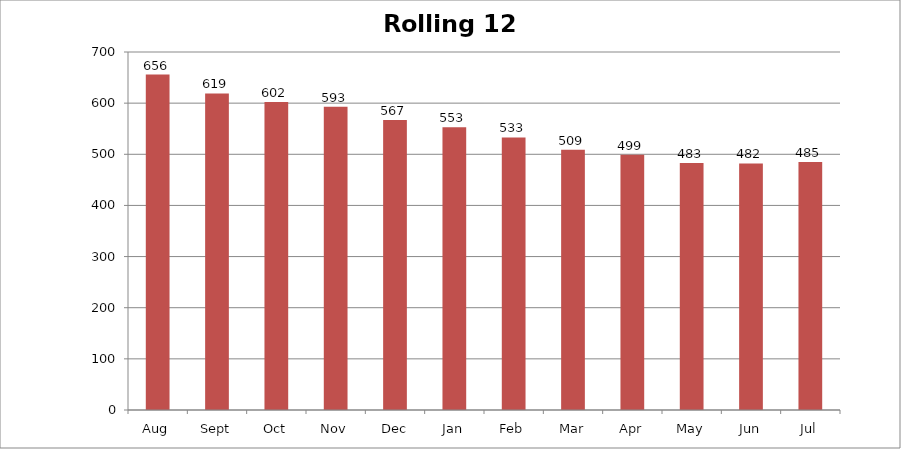
| Category | Rolling 12 Month |
|---|---|
| Aug | 656 |
| Sept | 619 |
| Oct | 602 |
| Nov | 593 |
| Dec | 567 |
| Jan | 553 |
| Feb | 533 |
| Mar | 509 |
| Apr | 499 |
| May | 483 |
| Jun | 482 |
| Jul | 485 |